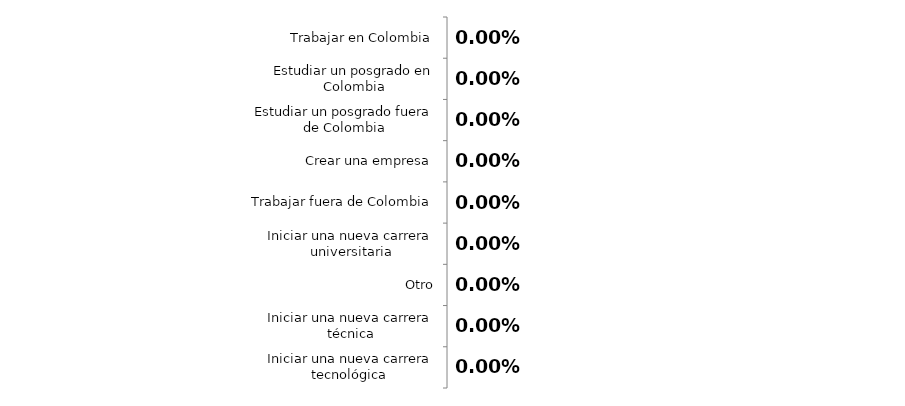
| Category | Series 0 |
|---|---|
| Iniciar una nueva carrera tecnológica  | 0 |
| Iniciar una nueva carrera técnica | 0 |
| Otro | 0 |
| Iniciar una nueva carrera universitaria | 0 |
| Trabajar fuera de Colombia | 0 |
| Crear una empresa | 0 |
| Estudiar un posgrado fuera de Colombia | 0 |
| Estudiar un posgrado en Colombia | 0 |
| Trabajar en Colombia | 0 |